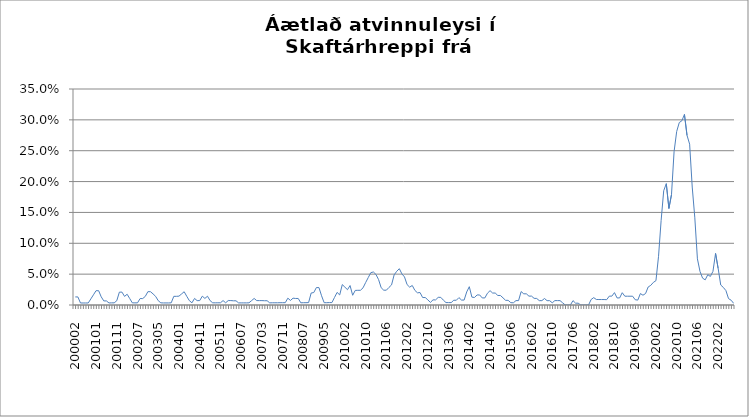
| Category | Series 0 |
|---|---|
| 200002 | 0.013 |
| 200003 | 0.013 |
| 200004 | 0.003 |
| 200005 | 0.003 |
| 200006 | 0.003 |
| 200007 | 0.003 |
| 200011 | 0.01 |
| 200012 | 0.017 |
| 200101 | 0.023 |
| 200102 | 0.023 |
| 200103 | 0.013 |
| 200104 | 0.007 |
| 200105 | 0.007 |
| 200106 | 0.003 |
| 200107 | 0.003 |
| 200108 | 0.003 |
| 200111 | 0.007 |
| 200112 | 0.021 |
| 200201 | 0.021 |
| 200202 | 0.014 |
| 200203 | 0.017 |
| 200204 | 0.01 |
| 200205 | 0.003 |
| 200206 | 0.003 |
| 200207 | 0.003 |
| 200210 | 0.01 |
| 200211 | 0.01 |
| 200212 | 0.014 |
| 200301 | 0.022 |
| 200302 | 0.022 |
| 200303 | 0.018 |
| 200304 | 0.014 |
| 200305 | 0.007 |
| 200306 | 0.003 |
| 200307 | 0.003 |
| 200308 | 0.003 |
| 200309 | 0.003 |
| 200310 | 0.004 |
| 200311 | 0.014 |
| 200312 | 0.014 |
| 200401 | 0.014 |
| 200402 | 0.018 |
| 200403 | 0.022 |
| 200404 | 0.014 |
| 200405 | 0.007 |
| 200406 | 0.004 |
| 200407 | 0.011 |
| 200408 | 0.007 |
| 200411 | 0.007 |
| 200412 | 0.014 |
| 200501 | 0.011 |
| 200502 | 0.014 |
| 200503 | 0.007 |
| 200504 | 0.004 |
| 200505 | 0.004 |
| 200510 | 0.004 |
| 200511 | 0.004 |
| 200512 | 0.007 |
| 200601 | 0.004 |
| 200602 | 0.007 |
| 200603 | 0.007 |
| 200604 | 0.007 |
| 200605 | 0.007 |
| 200606 | 0.003 |
| 200607 | 0.003 |
| 200608 | 0.003 |
| 200609 | 0.003 |
| 200610 | 0.004 |
| 200611 | 0.007 |
| 200612 | 0.011 |
| 200701 | 0.007 |
| 200702 | 0.007 |
| 200703 | 0.007 |
| 200704 | 0.007 |
| 200705 | 0.007 |
| 200706 | 0.003 |
| 200707 | 0.004 |
| 200708 | 0.004 |
| 200709 | 0.004 |
| 200710 | 0.004 |
| 200711 | 0.004 |
| 200712 | 0.004 |
| 200801 | 0.011 |
| 200802 | 0.007 |
| 200803 | 0.011 |
| 200804 | 0.011 |
| 200805 | 0.011 |
| 200806 | 0.004 |
| 200807 | 0.004 |
| 200808 | 0.004 |
| 200811 | 0.004 |
| 200812 | 0.019 |
| 200901 | 0.02 |
| 200902 | 0.028 |
| 200903 | 0.028 |
| 200904 | 0.015 |
| 200905 | 0.004 |
| 200906 | 0.004 |
| 200907 | 0.004 |
| 200908 | 0.004 |
| 200910 | 0.012 |
| 200911 | 0.02 |
| 200912 | 0.016 |
| 201001 | 0.033 |
| 201002 | 0.029 |
| 201003 | 0.025 |
| 201004 | 0.031 |
| 201005 | 0.016 |
| 201006 | 0.024 |
| 201007 | 0.024 |
| 201008 | 0.024 |
| 201009 | 0.028 |
| 201010 | 0.036 |
| 201011 | 0.044 |
| 201012 | 0.052 |
| 201101 | 0.053 |
| 201102 | 0.049 |
| 201103 | 0.041 |
| 201104 | 0.028 |
| 201105 | 0.024 |
| 201106 | 0.024 |
| 201107 | 0.028 |
| 201108 | 0.033 |
| 201109 | 0.049 |
| 201110 | 0.055 |
| 201111 | 0.059 |
| 201112 | 0.05 |
| 201201 | 0.045 |
| 201202 | 0.033 |
| 201203 | 0.029 |
| 201204 | 0.032 |
| 201205 | 0.024 |
| 201206 | 0.02 |
| 201207 | 0.02 |
| 201208 | 0.012 |
| 201209 | 0.012 |
| 201210 | 0.008 |
| 201211 | 0.004 |
| 201212 | 0.008 |
| 201301 | 0.008 |
| 201302 | 0.012 |
| 201303 | 0.012 |
| 201304 | 0.008 |
| 201305 | 0.004 |
| 201306 | 0.004 |
| 201307 | 0.004 |
| 201308 | 0.008 |
| 201309 | 0.008 |
| 201310 | 0.012 |
| 201311 | 0.008 |
| 201312 | 0.008 |
| 201401 | 0.021 |
| 201402 | 0.03 |
| 201403 | 0.013 |
| 201404 | 0.012 |
| 201405 | 0.016 |
| 201406 | 0.016 |
| 201407 | 0.011 |
| 201408 | 0.011 |
| 201409 | 0.019 |
| 201410 | 0.023 |
| 201411 | 0.019 |
| 201412 | 0.019 |
| 201501 | 0.015 |
| 201502 | 0.015 |
| 201503 | 0.012 |
| 201504 | 0.008 |
| 201505 | 0.008 |
| 201506 | 0.004 |
| 201507 | 0.004 |
| 201508 | 0.007 |
| 201509 | 0.007 |
| 201510 | 0.022 |
| 201511 | 0.018 |
| 201512 | 0.018 |
| 201601 | 0.014 |
| 201602 | 0.014 |
| 201603 | 0.011 |
| 201604 | 0.011 |
| 201605 | 0.007 |
| 201606 | 0.007 |
| 201607 | 0.011 |
| 201608 | 0.007 |
| 201609 | 0.007 |
| 201610 | 0.004 |
| 201611 | 0.007 |
| 201612 | 0.007 |
| 201701 | 0.007 |
| 201702 | 0.004 |
| 201703 | 0 |
| 201704 | 0 |
| 201705 | 0 |
| 201706 | 0.007 |
| 201707 | 0.003 |
| 201708 | 0.003 |
| 201709 | 0 |
| 201710 | 0 |
| 201711 | 0 |
| 201712 | 0 |
| 201801 | 0.009 |
| 201802 | 0.012 |
| 201803 | 0.009 |
| 201804 | 0.009 |
| 201805 | 0.009 |
| 201806 | 0.009 |
| 201807 | 0.009 |
| 201808 | 0.014 |
| 201809 | 0.014 |
| 201810 | 0.02 |
| 201811 | 0.011 |
| 201812 | 0.011 |
| 201901 | 0.02 |
| 201902 | 0.014 |
| 201903 | 0.014 |
| 201904 | 0.014 |
| 201905 | 0.014 |
| 201906 | 0.009 |
| 201907 | 0.008 |
| 201908 | 0.019 |
| 201909 | 0.016 |
| 201910 | 0.019 |
| 201911 | 0.029 |
| 201912 | 0.032 |
| 202001 | 0.037 |
| 202002 | 0.039 |
| 202003 | 0.079 |
| 202004 | 0.137 |
| 202005 | 0.185 |
| 202006 | 0.197 |
| 202007 | 0.156 |
| 202008 | 0.179 |
| 202009 | 0.249 |
| 202010 | 0.281 |
| 202011 | 0.296 |
| 202012 | 0.299 |
| 202101 | 0.309 |
| 202102 | 0.275 |
| 202103 | 0.261 |
| 202104 | 0.191 |
| 202105 | 0.141 |
| 202106 | 0.075 |
| 202107 | 0.054 |
| 202108 | 0.043 |
| 202109 | 0.041 |
| 202110 | 0.049 |
| 202111 | 0.046 |
| 202112 | 0.054 |
| 202201 | 0.084 |
| 202202 | 0.059 |
| 202203 | 0.032 |
| 202204 | 0.028 |
| 202205 | 0.023 |
| 202206 | 0.01 |
| 202207 | 0.008 |
| 202208 | 0.003 |